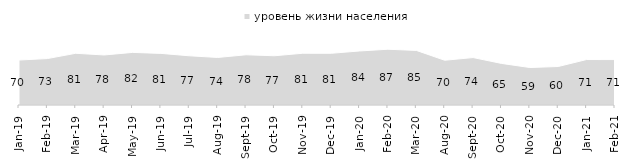
| Category | уровень жизни населения |
|---|---|
| 2019-01-01 | 70.25 |
| 2019-02-01 | 72.55 |
| 2019-03-01 | 80.806 |
| 2019-04-01 | 78.168 |
| 2019-05-01 | 82.169 |
| 2019-06-01 | 80.648 |
| 2019-07-01 | 76.881 |
| 2019-08-01 | 74.276 |
| 2019-09-01 | 78.465 |
| 2019-10-01 | 76.931 |
| 2019-11-01 | 80.842 |
| 2019-12-01 | 80.792 |
| 2020-01-01 | 84.406 |
| 2020-02-01 | 87.129 |
| 2020-03-01 | 85.275 |
| 2020-08-01 | 69.911 |
| 2020-09-01 | 74.116 |
| 2020-10-01 | 64.973 |
| 2020-11-01 | 58.55 |
| 2020-12-01 | 60.139 |
| 2021-01-01 | 71.038 |
| 2021-02-01 | 70.968 |